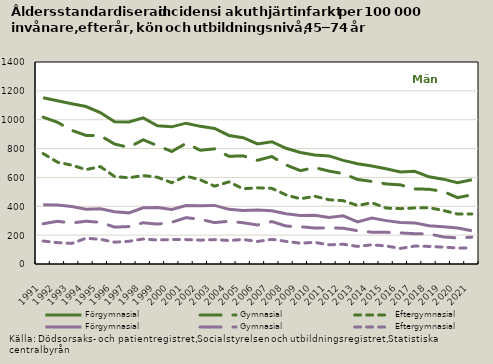
| Category | Förgymnasial | Gymnasial | Eftergymnasial | Eftergymnasial  |
|---|---|---|---|---|
| 1991.0 | 410.336 | 279.065 | 765.487 | 158.897 |
| 1992.0 | 408.366 | 295.793 | 705.918 | 148.143 |
| 1993.0 | 398.246 | 284.228 | 684.941 | 142.753 |
| 1994.0 | 380.08 | 296.362 | 654.108 | 178.398 |
| 1995.0 | 382.149 | 288.916 | 675.19 | 171.415 |
| 1996.0 | 362.421 | 255.566 | 606.154 | 151.151 |
| 1997.0 | 354.448 | 259.37 | 597.603 | 157.473 |
| 1998.0 | 389.401 | 285.85 | 613.213 | 173.142 |
| 1999.0 | 390.806 | 276.519 | 601.276 | 166.232 |
| 2000.0 | 377.622 | 289.137 | 563.359 | 169.809 |
| 2001.0 | 405.368 | 321.095 | 609.099 | 169.114 |
| 2002.0 | 404.256 | 309.789 | 583.189 | 165.143 |
| 2003.0 | 406.219 | 286.869 | 539.495 | 169.014 |
| 2004.0 | 378.724 | 296.4 | 569.022 | 162.79 |
| 2005.0 | 370.25 | 285.961 | 521.187 | 169.728 |
| 2006.0 | 374.856 | 270.281 | 527.989 | 156.179 |
| 2007.0 | 368.277 | 294.184 | 524.368 | 170.904 |
| 2008.0 | 348.418 | 263.024 | 478.974 | 156.704 |
| 2009.0 | 336.005 | 258.365 | 451.688 | 144.058 |
| 2010.0 | 338.439 | 249.584 | 469.789 | 149.954 |
| 2011.0 | 322.041 | 250.642 | 445.357 | 132.788 |
| 2012.0 | 334.267 | 247.837 | 438.819 | 136.928 |
| 2013.0 | 292.09 | 230.649 | 405.545 | 121.985 |
| 2014.0 | 319.111 | 220.471 | 424.472 | 132.954 |
| 2015.0 | 300.628 | 219.908 | 387.915 | 124.852 |
| 2016.0 | 287.973 | 215.285 | 383.588 | 108.043 |
| 2017.0 | 284.925 | 210.047 | 388.28 | 124.303 |
| 2018.0 | 264.463 | 208.938 | 390.143 | 121.834 |
| 2019.0 | 257.761 | 187.532 | 371.312 | 117.019 |
| 2020.0 | 249.87 | 180.835 | 346.065 | 110.556 |
| 2021.0 | 230.081 | 186 | 346.986 | 111 |